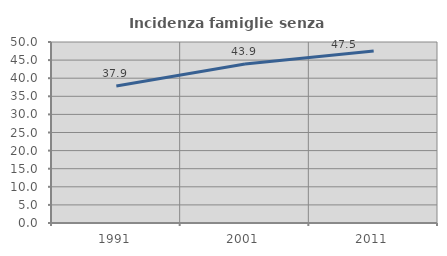
| Category | Incidenza famiglie senza nuclei |
|---|---|
| 1991.0 | 37.872 |
| 2001.0 | 43.902 |
| 2011.0 | 47.49 |